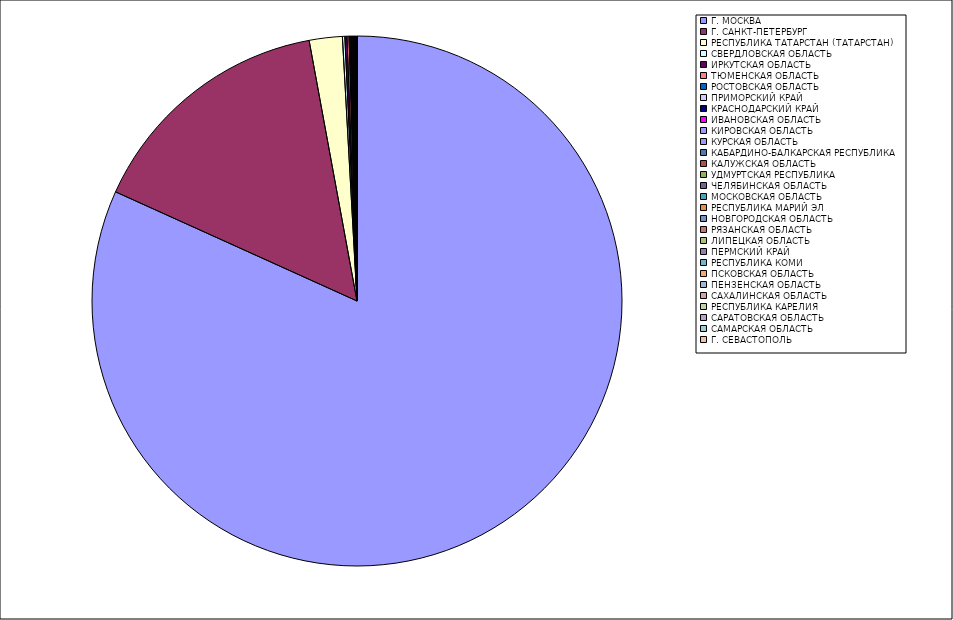
| Category | Оборот |
|---|---|
| Г. МОСКВА | 81.741 |
| Г. САНКТ-ПЕТЕРБУРГ | 15.347 |
| РЕСПУБЛИКА ТАТАРСТАН (ТАТАРСТАН) | 2.014 |
| СВЕРДЛОВСКАЯ ОБЛАСТЬ | 0.147 |
| ИРКУТСКАЯ ОБЛАСТЬ | 0.128 |
| ТЮМЕНСКАЯ ОБЛАСТЬ | 0.121 |
| РОСТОВСКАЯ ОБЛАСТЬ | 0.063 |
| ПРИМОРСКИЙ КРАЙ | 0.052 |
| КРАСНОДАРСКИЙ КРАЙ | 0.05 |
| ИВАНОВСКАЯ ОБЛАСТЬ | 0.049 |
| КИРОВСКАЯ ОБЛАСТЬ | 0.04 |
| КУРСКАЯ ОБЛАСТЬ | 0.038 |
| КАБАРДИНО-БАЛКАРСКАЯ РЕСПУБЛИКА | 0.027 |
| КАЛУЖСКАЯ ОБЛАСТЬ | 0.023 |
| УДМУРТСКАЯ РЕСПУБЛИКА | 0.02 |
| ЧЕЛЯБИНСКАЯ ОБЛАСТЬ | 0.018 |
| МОСКОВСКАЯ ОБЛАСТЬ | 0.016 |
| РЕСПУБЛИКА МАРИЙ ЭЛ | 0.015 |
| НОВГОРОДСКАЯ ОБЛАСТЬ | 0.01 |
| РЯЗАНСКАЯ ОБЛАСТЬ | 0.01 |
| ЛИПЕЦКАЯ ОБЛАСТЬ | 0.008 |
| ПЕРМСКИЙ КРАЙ | 0.007 |
| РЕСПУБЛИКА КОМИ | 0.007 |
| ПСКОВСКАЯ ОБЛАСТЬ | 0.006 |
| ПЕНЗЕНСКАЯ ОБЛАСТЬ | 0.005 |
| САХАЛИНСКАЯ ОБЛАСТЬ | 0.004 |
| РЕСПУБЛИКА КАРЕЛИЯ | 0.004 |
| САРАТОВСКАЯ ОБЛАСТЬ | 0.004 |
| САМАРСКАЯ ОБЛАСТЬ | 0.004 |
| Г. СЕВАСТОПОЛЬ | 0.003 |